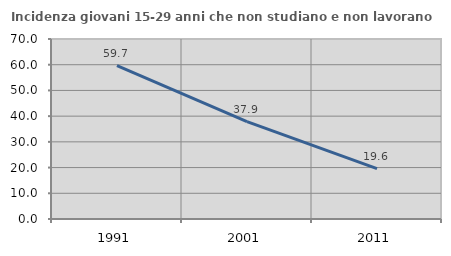
| Category | Incidenza giovani 15-29 anni che non studiano e non lavorano  |
|---|---|
| 1991.0 | 59.685 |
| 2001.0 | 37.879 |
| 2011.0 | 19.565 |